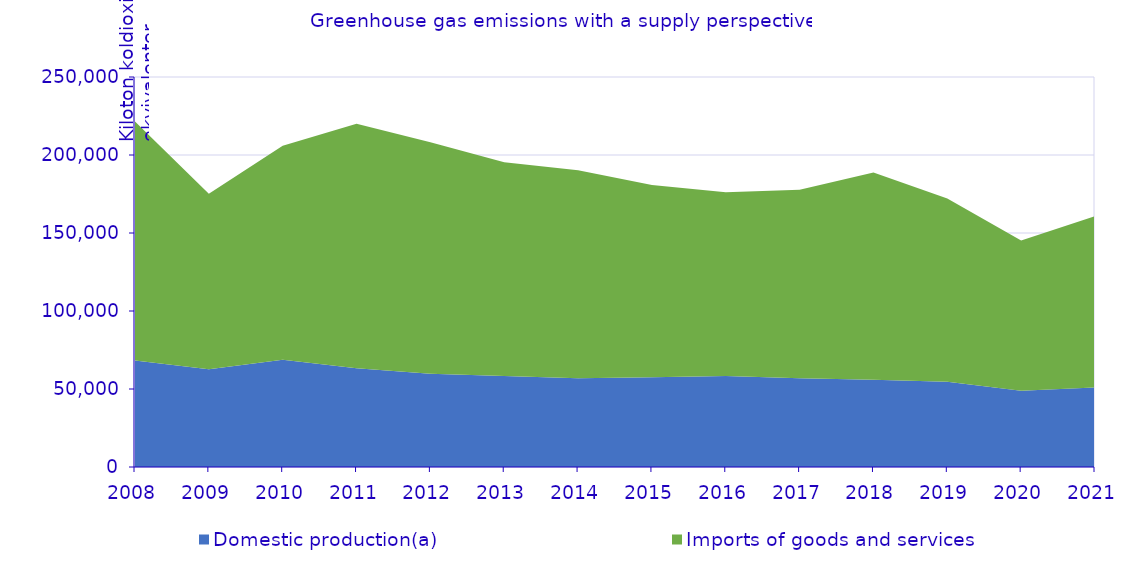
| Category | Domestic production(a) | Imports of goods and services |
|---|---|---|
| 2008.0 | 68191.958 | 153350.674 |
| 2009.0 | 62611.475 | 112540.548 |
| 2010.0 | 68783.8 | 137134.024 |
| 2011.0 | 63369.394 | 156726.107 |
| 2012.0 | 59840.502 | 148256.619 |
| 2013.0 | 58371.948 | 136979.63 |
| 2014.0 | 56902.913 | 133249.192 |
| 2015.0 | 57464.769 | 123267.922 |
| 2016.0 | 58288.397 | 117855.253 |
| 2017.0 | 56813.724 | 120894.336 |
| 2018.0 | 55975.287 | 132770.577 |
| 2019.0 | 54687.124 | 117400.312 |
| 2020.0 | 48941.028 | 96237.142 |
| 2021.0 | 51030.25 | 109758.613 |